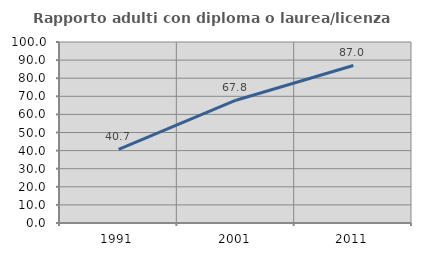
| Category | Rapporto adulti con diploma o laurea/licenza media  |
|---|---|
| 1991.0 | 40.678 |
| 2001.0 | 67.832 |
| 2011.0 | 87.037 |